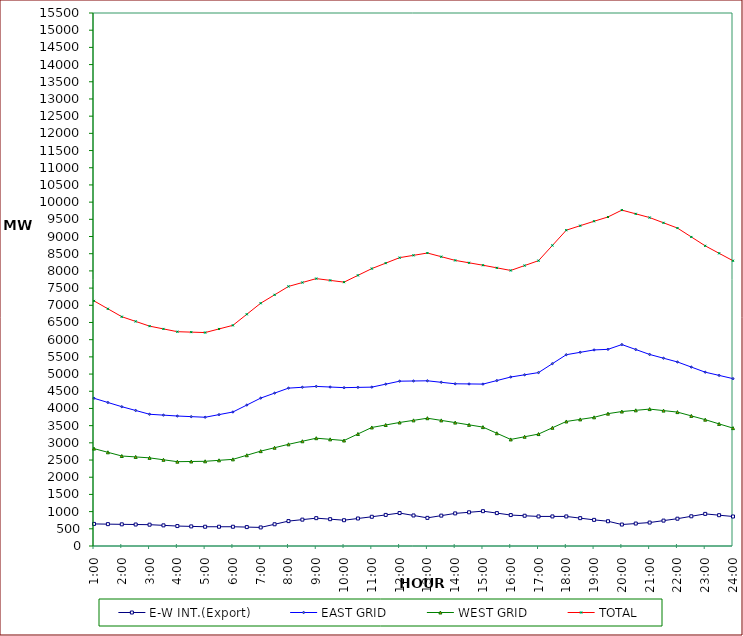
| Category | E-W INT.(Export) | EAST GRID | WEST GRID | TOTAL |
|---|---|---|---|---|
| 1:00 | 642 | 4296 | 2832 | 7128 |
| 1:30 | 636 | 4173.5 | 2724.5 | 6898 |
| 2:00 | 630 | 4051 | 2617 | 6668 |
| 2:30 | 625 | 3941 | 2590 | 6531 |
| 3:00 | 620 | 3831 | 2563 | 6394 |
| 3:30 | 600 | 3805.5 | 2507.5 | 6313 |
| 4:00 | 580 | 3780 | 2452 | 6232 |
| 4:30 | 570 | 3762 | 2457.5 | 6219.5 |
| 5:00 | 560 | 3744 | 2463 | 6207 |
| 5:30 | 560 | 3820.5 | 2491.5 | 6312 |
| 6:00 | 560 | 3897 | 2520 | 6417 |
| 6:30 | 550 | 4099 | 2639.5 | 6738.5 |
| 7:00 | 540 | 4301 | 2759 | 7060 |
| 7:30 | 632 | 4446 | 2858 | 7304 |
| 8:00 | 724 | 4591 | 2957 | 7548 |
| 8:30 | 767 | 4616 | 3046 | 7662 |
| 9:00 | 810 | 4641 | 3135 | 7776 |
| 9:30 | 780 | 4623 | 3101.5 | 7724.5 |
| 10:00 | 750 | 4605 | 3068 | 7673 |
| 10:30 | 800 | 4612.5 | 3257.5 | 7870 |
| 11:00 | 850 | 4620 | 3447 | 8067 |
| 11:30 | 904 | 4706.5 | 3519.5 | 8226 |
| 12:00 | 958 | 4793 | 3592 | 8385 |
| 12:30 | 888 | 4798.5 | 3654 | 8452.5 |
| 13:00 | 818 | 4804 | 3716 | 8520 |
| 13:30 | 883 | 4760.5 | 3652.5 | 8413 |
| 14:00 | 948 | 4717 | 3589 | 8306 |
| 14:30 | 980.5 | 4712.5 | 3523 | 8235.5 |
| 15:00 | 1013 | 4708 | 3457 | 8165 |
| 15:30 | 956.5 | 4811 | 3278 | 8089 |
| 16:00 | 900 | 4914 | 3099 | 8013 |
| 16:30 | 880 | 4978.5 | 3177 | 8155.5 |
| 17:00 | 860 | 5043 | 3255 | 8298 |
| 17:30 | 860 | 5303 | 3438 | 8741 |
| 18:00 | 860 | 5563 | 3621 | 9184 |
| 18:30 | 810 | 5632.5 | 3681.5 | 9314 |
| 19:00 | 760 | 5702 | 3742 | 9444 |
| 19:30 | 720 | 5719 | 3849 | 9568 |
| 20:00 | 624 | 5858 | 3910 | 9768 |
| 20:30 | 653 | 5714 | 3945.5 | 9659.5 |
| 21:00 | 682 | 5570 | 3981 | 9551 |
| 21:30 | 738 | 5461 | 3937.5 | 9398.5 |
| 22:00 | 794 | 5352 | 3894 | 9246 |
| 22:30 | 864 | 5203.5 | 3784 | 8987.5 |
| 23:00 | 934 | 5055 | 3674 | 8729 |
| 23:30 | 896 | 4961 | 3551 | 8512 |
| 24:00 | 858 | 4867 | 3428 | 8295 |